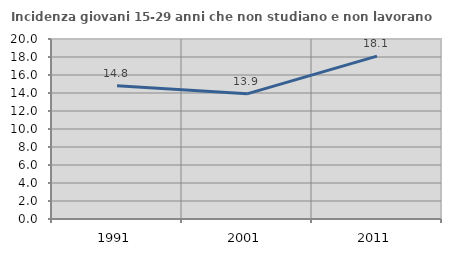
| Category | Incidenza giovani 15-29 anni che non studiano e non lavorano  |
|---|---|
| 1991.0 | 14.797 |
| 2001.0 | 13.907 |
| 2011.0 | 18.103 |